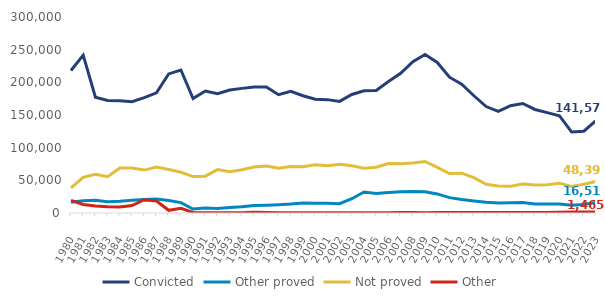
| Category | Convicted | Other proved | Not proved | Other |
|---|---|---|---|---|
| 1980.0 | 218122 | 16532 | 38318 | 19344 |
| 1981.0 | 241621 | 18795 | 54623 | 13043 |
| 1982.0 | 177182 | 19602 | 59127 | 10648 |
| 1983.0 | 172193 | 17362 | 55443 | 9686 |
| 1984.0 | 171889 | 17912 | 68867 | 9360 |
| 1985.0 | 170342 | 19333 | 68699 | 11307 |
| 1986.0 | 176555 | 20651 | 65675 | 20344 |
| 1987.0 | 183884 | 21334 | 70358 | 18455 |
| 1988.0 | 212877 | 18973 | 66453 | 4135 |
| 1989.0 | 218832 | 15854 | 62342 | 7088 |
| 1990.0 | 175137 | 6159 | 55803 | 843 |
| 1991.0 | 186766 | 7482 | 56406 | 405 |
| 1992.0 | 182587 | 7050 | 66392 | 277 |
| 1993.0 | 188315 | 8554 | 63307 | 317 |
| 1994.0 | 190744 | 9638 | 66101 | 309 |
| 1995.0 | 192732 | 11325 | 70524 | 982 |
| 1996.0 | 192898 | 11949 | 72059 | 741 |
| 1997.0 | 181155 | 12735 | 68594 | 397 |
| 1998.0 | 186309 | 13612 | 71141 | 281 |
| 1999.0 | 179483 | 15442 | 70674 | 311 |
| 2000.0 | 174081 | 15109 | 73980 | 383 |
| 2001.0 | 173527 | 14923 | 72263 | 376 |
| 2002.0 | 170777 | 14342 | 74452 | 499 |
| 2003.0 | 181378 | 21845 | 72461 | 405 |
| 2004.0 | 187157 | 32199 | 68600 | 350 |
| 2005.0 | 187495 | 29716 | 70038 | 405 |
| 2006.0 | 201220 | 31373 | 75798 | 317 |
| 2007.0 | 213876 | 32359 | 75231 | 635 |
| 2008.0 | 231586 | 32965 | 76706 | 748 |
| 2009.0 | 242506 | 32577 | 78848 | 395 |
| 2010.0 | 230356 | 29184 | 69874 | 581 |
| 2011.0 | 207855 | 23517 | 60438 | 806 |
| 2012.0 | 197224 | 20566 | 61000 | 914 |
| 2013.0 | 179447 | 18257 | 54023 | 707 |
| 2014.0 | 162926 | 16314 | 43855 | 626 |
| 2015.0 | 155574 | 15258 | 41429 | 810 |
| 2016.0 | 164262 | 15613 | 41125 | 736 |
| 2017.0 | 167628 | 16178 | 44260 | 941 |
| 2018.0 | 158463 | 13820 | 43005 | 810 |
| 2019.0 | 153689 | 13692 | 43398 | 775 |
| 2020.0 | 148919 | 13855 | 45668 | 1142 |
| 2021.0 | 124139 | 11790 | 40753 | 1412 |
| 2022.0 | 125168 | 12875 | 44067 | 1349 |
| 2023.0 | 141570 | 16512 | 48396 | 1465 |